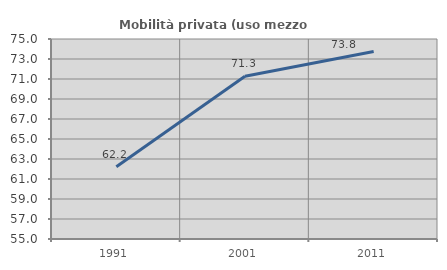
| Category | Mobilità privata (uso mezzo privato) |
|---|---|
| 1991.0 | 62.224 |
| 2001.0 | 71.27 |
| 2011.0 | 73.751 |